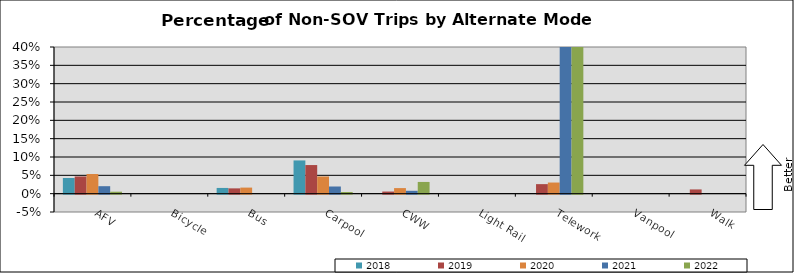
| Category | 2018 | 2019 | 2020 | 2021 | 2022 |
|---|---|---|---|---|---|
| AFV | 0.043 | 0.047 | 0.054 | 0.02 | 0.005 |
| Bicycle | 0 | 0 | 0 | 0 | 0 |
| Bus | 0.016 | 0.014 | 0.017 | 0 | 0 |
| Carpool | 0.091 | 0.078 | 0.047 | 0.02 | 0.005 |
| CWW | 0 | 0.006 | 0.015 | 0.008 | 0.032 |
| Light Rail | 0 | 0 | 0 | 0 | 0 |
| Telework | 0 | 0.026 | 0.03 | 0.508 | 0.594 |
| Vanpool | 0 | 0 | 0 | 0 | 0 |
| Walk | 0 | 0.012 | 0 | 0 | 0 |